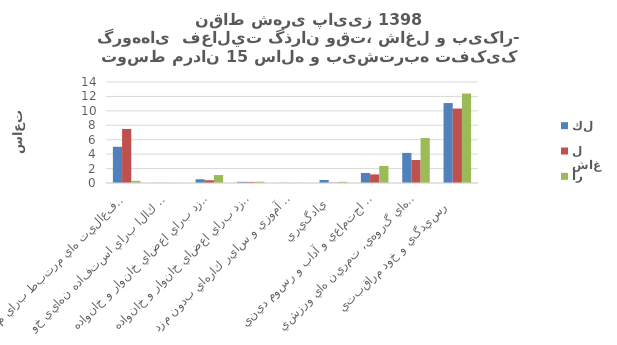
| Category | كل | شاغل | بيكار |
|---|---|---|---|
| اشتغال و فعاليت هاي مرتبط براي مزد  | 5.02 | 7.49 | 0.3 |
| توليد كالا براي استفاده نهايي خود   | 0.02 | 0.01 | 0.01 |
| خدمات خانگي بدون مزد براي اعضاي خانوار و خانواده   | 0.52 | 0.38 | 1.1 |
| خدمات مراقبتي بدون مزد براي اعضاي خانوار و خانواده   | 0.16 | 0.15 | 0.18 |
| كارداوطلبانه بدون مزد، كار آموزي و ساير كارهاي بدون مزد  | 0.02 | 0.01 | 0.02 |
| يادگيري  | 0.42 | 0.05 | 0.16 |
| معاشرت، ارتباط، مشاركت اجتماعي و آداب و رسوم ديني  | 1.39 | 1.19 | 2.37 |
| فرهنگ، فراغت، رسانه هاي گروهي، تمرين هاي ورزشي  | 4.17 | 3.19 | 6.24 |
| رسيدگي و خود مراقبتي   | 11.08 | 10.32 | 12.42 |